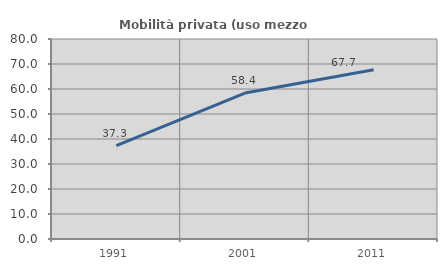
| Category | Mobilità privata (uso mezzo privato) |
|---|---|
| 1991.0 | 37.321 |
| 2001.0 | 58.369 |
| 2011.0 | 67.681 |